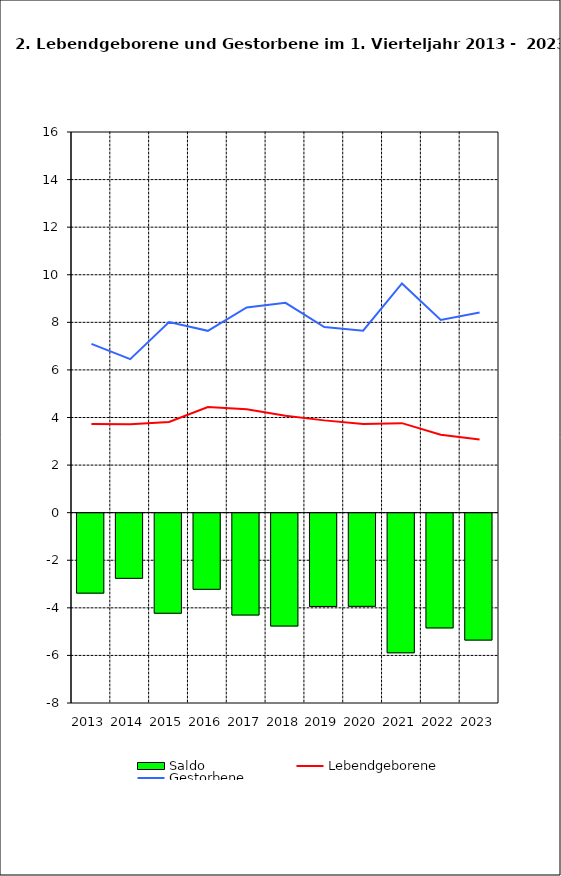
| Category | Saldo |
|---|---|
| 2013.0 | -3.361 |
| 2014.0 | -2.739 |
| 2015.0 | -4.206 |
| 2016.0 | -3.2 |
| 2017.0 | -4.282 |
| 2018.0 | -4.744 |
| 2019.0 | -3.921 |
| 2020.0 | -3.916 |
| 2021.0 | -5.87 |
| 2022.0 | -4.823 |
| 2023.0 | -5.335 |